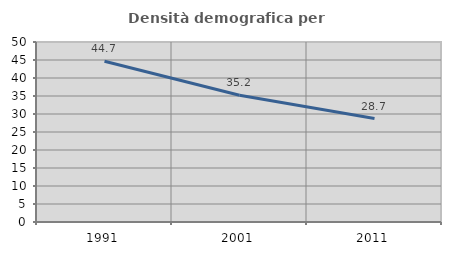
| Category | Densità demografica |
|---|---|
| 1991.0 | 44.674 |
| 2001.0 | 35.198 |
| 2011.0 | 28.732 |